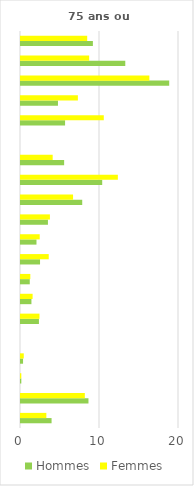
| Category | Hommes | Femmes |
|---|---|---|
| 0 | 3.87 | 3.21 |
| 1 | 8.54 | 8.08 |
| 2 | 0.04 | 0.04 |
| 3 | 0.26 | 0.35 |
| 4 | 0 | 0 |
| 5 | 2.27 | 2.34 |
| 6 | 1.32 | 1.47 |
| 7 | 1.11 | 1.18 |
| 8 | 2.41 | 3.51 |
| 9 | 1.96 | 2.37 |
| 10 | 3.41 | 3.66 |
| 11 | 7.75 | 6.59 |
| 12 | 10.28 | 12.26 |
| 13 | 5.46 | 4.01 |
| 14 | 0 | 0 |
| 15 | 5.58 | 10.48 |
| 16 | 4.68 | 7.2 |
| 17 | 18.76 | 16.25 |
| 18 | 13.2 | 8.63 |
| 19 | 9.1 | 8.38 |